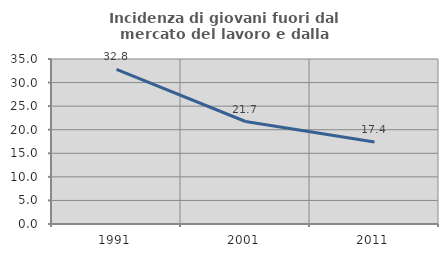
| Category | Incidenza di giovani fuori dal mercato del lavoro e dalla formazione  |
|---|---|
| 1991.0 | 32.787 |
| 2001.0 | 21.739 |
| 2011.0 | 17.391 |